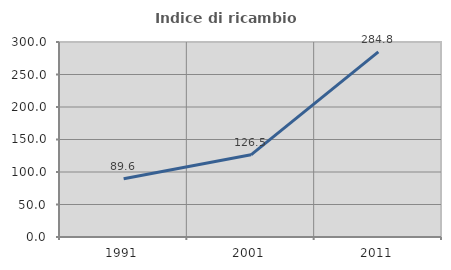
| Category | Indice di ricambio occupazionale  |
|---|---|
| 1991.0 | 89.625 |
| 2001.0 | 126.471 |
| 2011.0 | 284.795 |